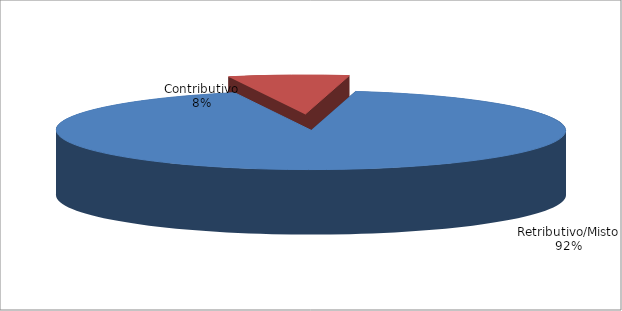
| Category | Series 1 |
|---|---|
| Retributivo/Misto | 280995 |
| Contributivo | 23222 |